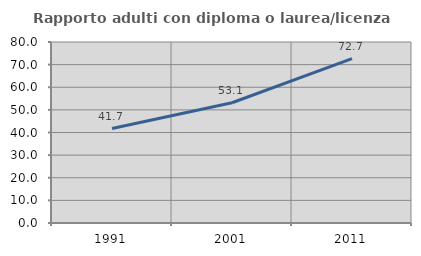
| Category | Rapporto adulti con diploma o laurea/licenza media  |
|---|---|
| 1991.0 | 41.748 |
| 2001.0 | 53.147 |
| 2011.0 | 72.671 |